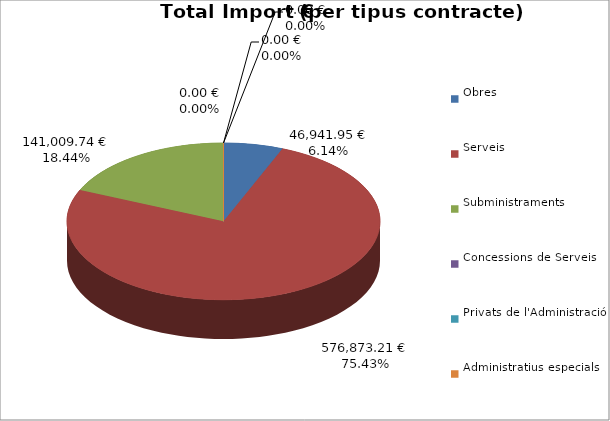
| Category | Total preu
(amb IVA) |
|---|---|
| Obres | 46941.95 |
| Serveis | 576873.21 |
| Subministraments | 141009.74 |
| Concessions de Serveis | 0 |
| Privats de l'Administració | 0 |
| Administratius especials | 0 |